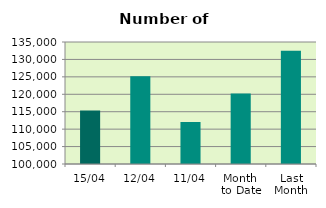
| Category | Series 0 |
|---|---|
| 15/04 | 115328 |
| 12/04 | 125172 |
| 11/04 | 112054 |
| Month 
to Date | 120222.909 |
| Last
Month | 132498.571 |